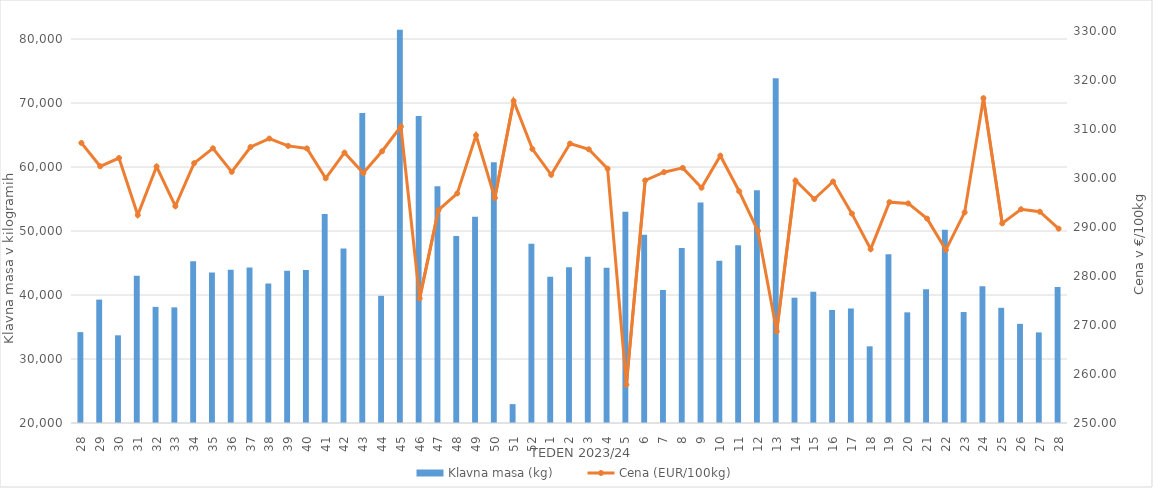
| Category | Klavna masa (kg) |
|---|---|
| 28.0 | 34201 |
| 29.0 | 39279 |
| 30.0 | 33702 |
| 31.0 | 43020 |
| 32.0 | 38146 |
| 33.0 | 38070 |
| 34.0 | 45290 |
| 35.0 | 43513 |
| 36.0 | 43945 |
| 37.0 | 44302 |
| 38.0 | 41798 |
| 39.0 | 43790 |
| 40.0 | 43913 |
| 41.0 | 52663 |
| 42.0 | 47275 |
| 43.0 | 68419 |
| 44.0 | 39872 |
| 45.0 | 81439 |
| 46.0 | 67983 |
| 47.0 | 57006 |
| 48.0 | 49204 |
| 49.0 | 52219 |
| 50.0 | 60759 |
| 51.0 | 22954 |
| 52.0 | 48002 |
| 1.0 | 42866 |
| 2.0 | 44318 |
| 3.0 | 45969 |
| 4.0 | 44266 |
| 5.0 | 52991 |
| 6.0 | 49406 |
| 7.0 | 40769 |
| 8.0 | 47349 |
| 9.0 | 54448 |
| 10.0 | 45343 |
| 11.0 | 47770 |
| 12.0 | 56370 |
| 13.0 | 73886 |
| 14.0 | 39581 |
| 15.0 | 40490 |
| 16.0 | 37654 |
| 17.0 | 37894 |
| 18.0 | 31981 |
| 19.0 | 46375 |
| 20.0 | 37290 |
| 21.0 | 40893 |
| 22.0 | 50178 |
| 23.0 | 37338 |
| 24.0 | 41348 |
| 25.0 | 37999 |
| 26.0 | 35494 |
| 27.0 | 34153 |
| 28.0 | 41250 |